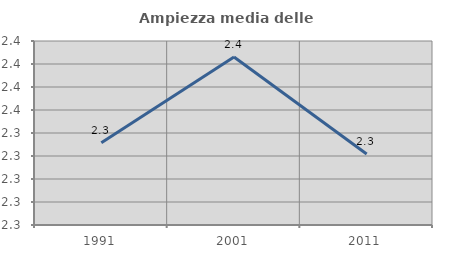
| Category | Ampiezza media delle famiglie |
|---|---|
| 1991.0 | 2.332 |
| 2001.0 | 2.406 |
| 2011.0 | 2.322 |